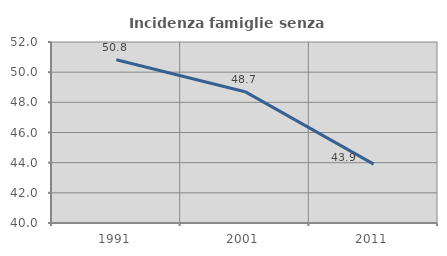
| Category | Incidenza famiglie senza nuclei |
|---|---|
| 1991.0 | 50.82 |
| 2001.0 | 48.707 |
| 2011.0 | 43.902 |